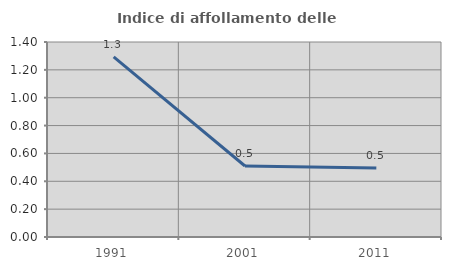
| Category | Indice di affollamento delle abitazioni  |
|---|---|
| 1991.0 | 1.293 |
| 2001.0 | 0.51 |
| 2011.0 | 0.496 |